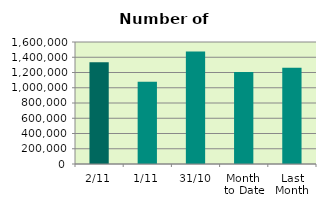
| Category | Series 0 |
|---|---|
| 2/11 | 1334852 |
| 1/11 | 1078686 |
| 31/10 | 1475446 |
| Month 
to Date | 1206769 |
| Last
Month | 1260789.391 |